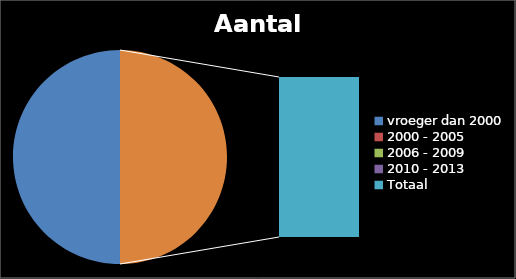
| Category | Aantal |
|---|---|
| vroeger dan 2000 | 36 |
| 2000 - 2005 | 0 |
| 2006 - 2009 | 0 |
| 2010 - 2013 | 0 |
| Totaal | 36 |